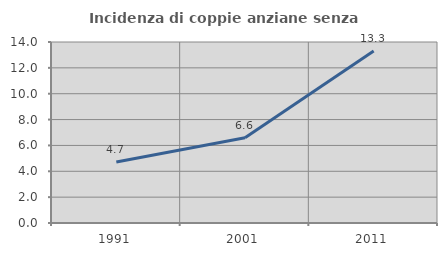
| Category | Incidenza di coppie anziane senza figli  |
|---|---|
| 1991.0 | 4.72 |
| 2001.0 | 6.596 |
| 2011.0 | 13.299 |